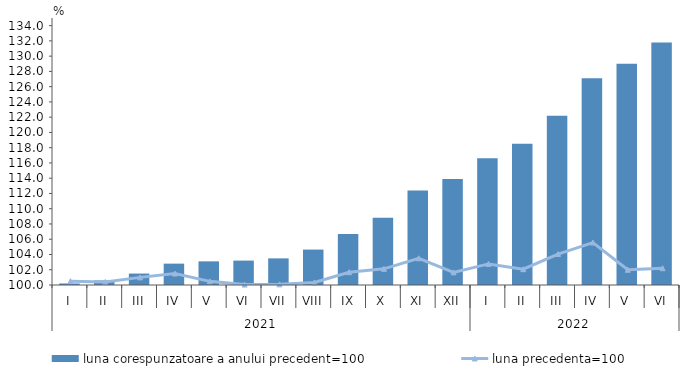
| Category | luna corespunzatoare a anului precedent=100 |
|---|---|
| 0 | 100.2 |
| 1 | 100.6 |
| 2 | 101.5 |
| 3 | 102.8 |
| 4 | 103.1 |
| 5 | 103.2 |
| 6 | 103.49 |
| 7 | 104.645 |
| 8 | 106.675 |
| 9 | 108.8 |
| 10 | 112.4 |
| 11 | 113.9 |
| 12 | 116.6 |
| 13 | 118.5 |
| 14 | 122.2 |
| 15 | 127.1 |
| 16 | 129 |
| 17 | 131.8 |